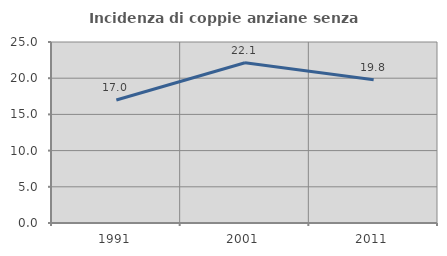
| Category | Incidenza di coppie anziane senza figli  |
|---|---|
| 1991.0 | 16.993 |
| 2001.0 | 22.137 |
| 2011.0 | 19.792 |